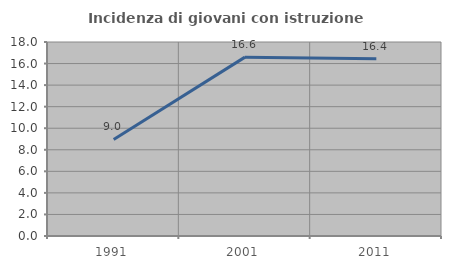
| Category | Incidenza di giovani con istruzione universitaria |
|---|---|
| 1991.0 | 8.961 |
| 2001.0 | 16.596 |
| 2011.0 | 16.438 |